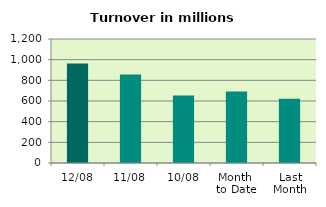
| Category | Series 0 |
|---|---|
| 12/08 | 961.897 |
| 11/08 | 857.446 |
| 10/08 | 653.32 |
| Month 
to Date | 691.472 |
| Last
Month | 622.259 |